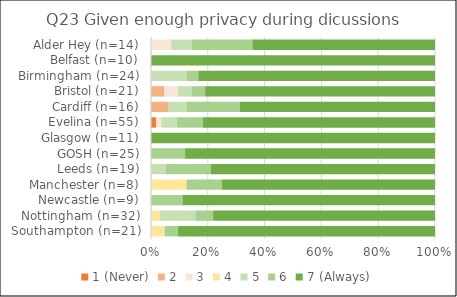
| Category | 1 (Never) | 2 | 3 | 4 | 5 | 6 | 7 (Always) |
|---|---|---|---|---|---|---|---|
| Southampton (n=21) | 0 | 0 | 0 | 1 | 0 | 1 | 19 |
| Nottingham (n=32) | 0 | 0 | 0 | 1 | 4 | 2 | 25 |
| Newcastle (n=9) | 0 | 0 | 0 | 0 | 0 | 1 | 8 |
| Manchester (n=8) | 0 | 0 | 0 | 1 | 0 | 1 | 6 |
| Leeds (n=19) | 0 | 0 | 0 | 0 | 1 | 3 | 15 |
| GOSH (n=25) | 0 | 0 | 0 | 0 | 0 | 3 | 22 |
| Glasgow (n=11) | 0 | 0 | 0 | 0 | 0 | 0 | 11 |
| Evelina (n=55) | 1 | 0 | 1 | 0 | 3 | 5 | 45 |
| Cardiff (n=16) | 0 | 1 | 0 | 0 | 1 | 3 | 11 |
| Bristol (n=21) | 0 | 1 | 1 | 0 | 1 | 1 | 17 |
| Birmingham (n=24) | 0 | 0 | 0 | 0 | 3 | 1 | 20 |
| Belfast (n=10) | 0 | 0 | 0 | 0 | 0 | 0 | 10 |
| Alder Hey (n=14) | 0 | 0 | 1 | 0 | 1 | 3 | 9 |